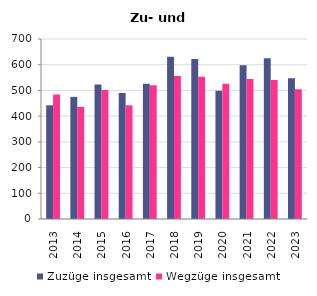
| Category | Zuzüge insgesamt | Wegzüge insgesamt |
|---|---|---|
| 2013.0 | 442 | 484 |
| 2014.0 | 475 | 436 |
| 2015.0 | 523 | 502 |
| 2016.0 | 490 | 442 |
| 2017.0 | 526 | 520 |
| 2018.0 | 631 | 556 |
| 2019.0 | 622 | 553 |
| 2020.0 | 499 | 526 |
| 2021.0 | 598 | 544 |
| 2022.0 | 625 | 541 |
| 2023.0 | 547 | 505 |